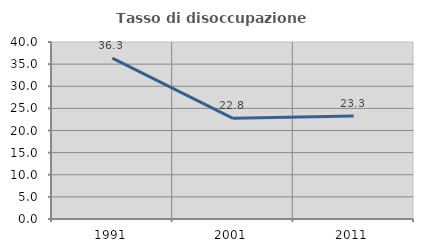
| Category | Tasso di disoccupazione giovanile  |
|---|---|
| 1991.0 | 36.348 |
| 2001.0 | 22.756 |
| 2011.0 | 23.256 |